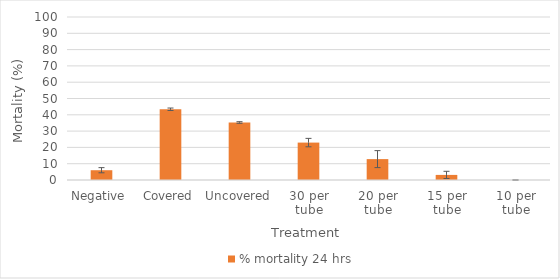
| Category | % mortality 24 hrs |
|---|---|
| Negative  | 6 |
| Covered | 43.396 |
| Uncovered | 35.294 |
| 30 per tube | 22.951 |
| 20 per tube | 12.821 |
| 15 per tube | 3.125 |
| 10 per tube | 0 |